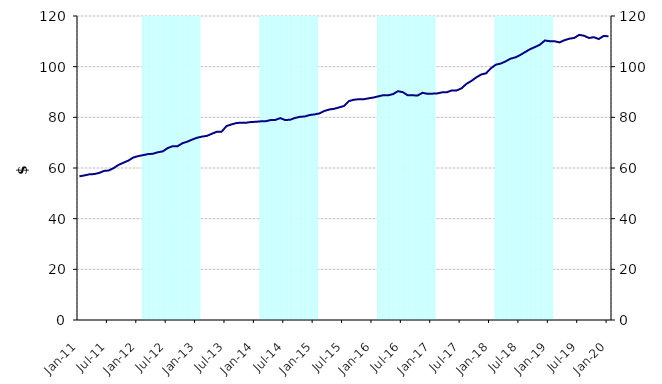
| Category | Series 1 |
|---|---|
| 0 | 0 |
| 1900-01-01 | 0 |
| 1900-01-02 | 0 |
| 1900-01-03 | 0 |
| 1900-01-04 | 0 |
| 1900-01-05 | 0 |
| 1900-01-06 | 0 |
| 1900-01-07 | 0 |
| 1900-01-08 | 0 |
| 1900-01-09 | 0 |
| 1900-01-10 | 0 |
| 1900-01-11 | 0 |
| 1900-01-12 | 0 |
| 1900-01-13 | 120000000 |
| 1900-01-14 | 120000000 |
| 1900-01-15 | 120000000 |
| 1900-01-16 | 120000000 |
| 1900-01-17 | 120000000 |
| 1900-01-18 | 120000000 |
| 1900-01-19 | 120000000 |
| 1900-01-20 | 120000000 |
| 1900-01-21 | 120000000 |
| 1900-01-22 | 120000000 |
| 1900-01-23 | 120000000 |
| 1900-01-24 | 120000000 |
| 1900-01-25 | 0 |
| 1900-01-26 | 0 |
| 1900-01-27 | 0 |
| 1900-01-28 | 0 |
| 1900-01-29 | 0 |
| 1900-01-30 | 0 |
| 1900-01-31 | 0 |
| 1900-02-01 | 0 |
| 1900-02-02 | 0 |
| 1900-02-03 | 0 |
| 1900-02-04 | 0 |
| 1900-02-05 | 0 |
| 1900-02-06 | 120000000 |
| 1900-02-07 | 120000000 |
| 1900-02-08 | 120000000 |
| 1900-02-09 | 120000000 |
| 1900-02-10 | 120000000 |
| 1900-02-11 | 120000000 |
| 1900-02-12 | 120000000 |
| 1900-02-13 | 120000000 |
| 1900-02-14 | 120000000 |
| 1900-02-15 | 120000000 |
| 1900-02-16 | 120000000 |
| 1900-02-17 | 120000000 |
| 1900-02-18 | 0 |
| 1900-02-19 | 0 |
| 1900-02-20 | 0 |
| 1900-02-21 | 0 |
| 1900-02-22 | 0 |
| 1900-02-23 | 0 |
| 1900-02-24 | 0 |
| 1900-02-25 | 0 |
| 1900-02-26 | 0 |
| 1900-02-27 | 0 |
| 1900-02-28 | 0 |
| 1900-02-28 | 0 |
| 1900-03-01 | 120000000 |
| 1900-03-02 | 120000000 |
| 1900-03-03 | 120000000 |
| 1900-03-04 | 120000000 |
| 1900-03-05 | 120000000 |
| 1900-03-06 | 120000000 |
| 1900-03-07 | 120000000 |
| 1900-03-08 | 120000000 |
| 1900-03-09 | 120000000 |
| 1900-03-10 | 120000000 |
| 1900-03-11 | 120000000 |
| 1900-03-12 | 120000000 |
| 1900-03-13 | 0 |
| 1900-03-14 | 0 |
| 1900-03-15 | 0 |
| 1900-03-16 | 0 |
| 1900-03-17 | 0 |
| 1900-03-18 | 0 |
| 1900-03-19 | 0 |
| 1900-03-20 | 0 |
| 1900-03-21 | 0 |
| 1900-03-22 | 0 |
| 1900-03-23 | 0 |
| 1900-03-24 | 0 |
| 1900-03-25 | 120000000 |
| 1900-03-26 | 120000000 |
| 1900-03-27 | 120000000 |
| 1900-03-28 | 120000000 |
| 1900-03-29 | 120000000 |
| 1900-03-30 | 120000000 |
| 1900-03-31 | 120000000 |
| 1900-04-01 | 120000000 |
| 1900-04-02 | 120000000 |
| 1900-04-03 | 120000000 |
| 1900-04-04 | 120000000 |
| 1900-04-05 | 120000000 |
| 1900-04-06 | 0 |
| 1900-04-07 | 0 |
| 1900-04-08 | 0 |
| 1900-04-09 | 0 |
| 1900-04-10 | 0 |
| 1900-04-11 | 0 |
| 1900-04-12 | 0 |
| 1900-04-13 | 0 |
| 1900-04-14 | 0 |
| 1900-04-15 | 0 |
| 1900-04-16 | 0 |
| 1900-04-17 | 0 |